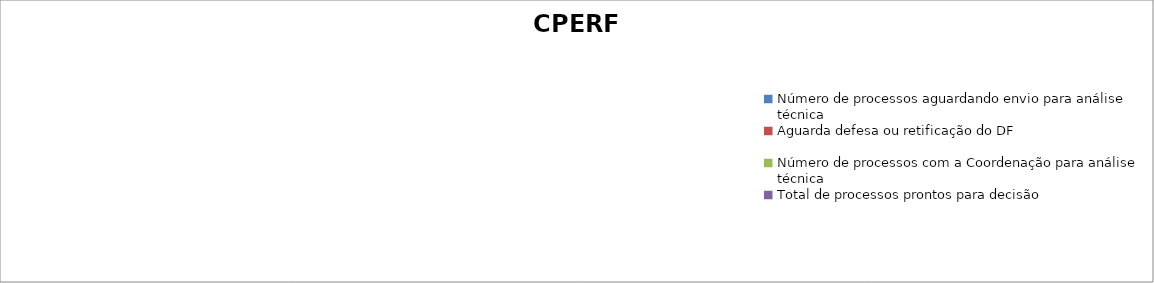
| Category | CPERF |
|---|---|
| Número de processos aguardando envio para análise técnica | 0 |
| Aguarda defesa ou retificação do DF | 0 |
| Número de processos com a Coordenação para análise técnica | 0 |
| Total de processos prontos para decisão | 0 |